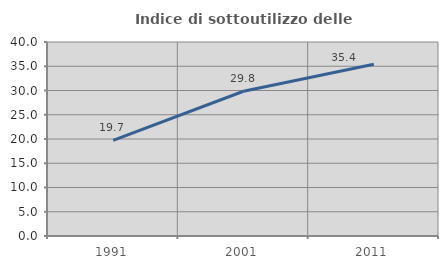
| Category | Indice di sottoutilizzo delle abitazioni  |
|---|---|
| 1991.0 | 19.701 |
| 2001.0 | 29.844 |
| 2011.0 | 35.416 |